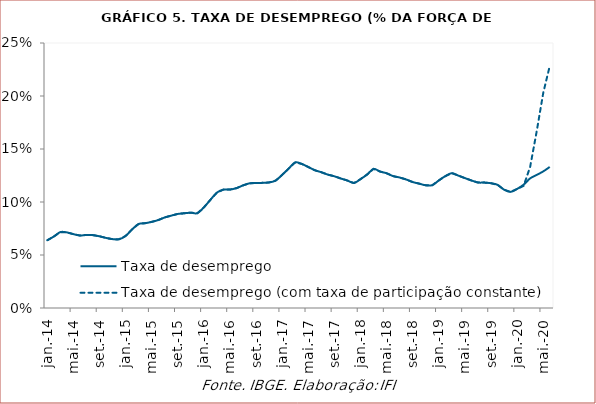
| Category | Taxa de desemprego | Taxa de desemprego (com taxa de participação constante) |
|---|---|---|
| 2014-01-01 | 0.064 | 0.064 |
| 2014-02-01 | 0.067 | 0.067 |
| 2014-03-01 | 0.072 | 0.072 |
| 2014-04-01 | 0.071 | 0.071 |
| 2014-05-01 | 0.07 | 0.07 |
| 2014-06-01 | 0.068 | 0.068 |
| 2014-07-01 | 0.069 | 0.069 |
| 2014-08-01 | 0.069 | 0.069 |
| 2014-09-01 | 0.068 | 0.068 |
| 2014-10-01 | 0.066 | 0.066 |
| 2014-11-01 | 0.065 | 0.065 |
| 2014-12-01 | 0.065 | 0.065 |
| 2015-01-01 | 0.068 | 0.068 |
| 2015-02-01 | 0.074 | 0.074 |
| 2015-03-01 | 0.079 | 0.079 |
| 2015-04-01 | 0.08 | 0.08 |
| 2015-05-01 | 0.081 | 0.081 |
| 2015-06-01 | 0.083 | 0.083 |
| 2015-07-01 | 0.085 | 0.085 |
| 2015-08-01 | 0.087 | 0.087 |
| 2015-09-01 | 0.089 | 0.089 |
| 2015-10-01 | 0.089 | 0.089 |
| 2015-11-01 | 0.09 | 0.09 |
| 2015-12-01 | 0.089 | 0.089 |
| 2016-01-01 | 0.095 | 0.095 |
| 2016-02-01 | 0.102 | 0.102 |
| 2016-03-01 | 0.109 | 0.109 |
| 2016-04-01 | 0.112 | 0.112 |
| 2016-05-01 | 0.112 | 0.112 |
| 2016-06-01 | 0.113 | 0.113 |
| 2016-07-01 | 0.116 | 0.116 |
| 2016-08-01 | 0.118 | 0.118 |
| 2016-09-01 | 0.118 | 0.118 |
| 2016-10-01 | 0.118 | 0.118 |
| 2016-11-01 | 0.118 | 0.118 |
| 2016-12-01 | 0.12 | 0.12 |
| 2017-01-01 | 0.126 | 0.126 |
| 2017-02-01 | 0.132 | 0.132 |
| 2017-03-01 | 0.137 | 0.137 |
| 2017-04-01 | 0.136 | 0.136 |
| 2017-05-01 | 0.133 | 0.133 |
| 2017-06-01 | 0.13 | 0.13 |
| 2017-07-01 | 0.128 | 0.128 |
| 2017-08-01 | 0.126 | 0.126 |
| 2017-09-01 | 0.124 | 0.124 |
| 2017-10-01 | 0.122 | 0.122 |
| 2017-11-01 | 0.12 | 0.12 |
| 2017-12-01 | 0.118 | 0.118 |
| 2018-01-01 | 0.122 | 0.122 |
| 2018-02-01 | 0.126 | 0.126 |
| 2018-03-01 | 0.131 | 0.131 |
| 2018-04-01 | 0.129 | 0.129 |
| 2018-05-01 | 0.127 | 0.127 |
| 2018-06-01 | 0.124 | 0.124 |
| 2018-07-01 | 0.123 | 0.123 |
| 2018-08-01 | 0.121 | 0.121 |
| 2018-09-01 | 0.119 | 0.119 |
| 2018-10-01 | 0.117 | 0.117 |
| 2018-11-01 | 0.116 | 0.116 |
| 2018-12-01 | 0.116 | 0.116 |
| 2019-01-01 | 0.12 | 0.12 |
| 2019-02-01 | 0.124 | 0.124 |
| 2019-03-01 | 0.127 | 0.127 |
| 2019-04-01 | 0.125 | 0.125 |
| 2019-05-01 | 0.123 | 0.123 |
| 2019-06-01 | 0.12 | 0.12 |
| 2019-07-01 | 0.118 | 0.118 |
| 2019-08-01 | 0.118 | 0.118 |
| 2019-09-01 | 0.118 | 0.118 |
| 2019-10-01 | 0.116 | 0.116 |
| 2019-11-01 | 0.112 | 0.112 |
| 2019-12-01 | 0.11 | 0.11 |
| 2020-01-01 | 0.112 | 0.112 |
| 2020-02-01 | 0.116 | 0.115 |
| 2020-03-01 | 0.122 | 0.133 |
| 2020-04-01 | 0.126 | 0.167 |
| 2020-05-01 | 0.129 | 0.203 |
| 2020-06-01 | 0.133 | 0.228 |